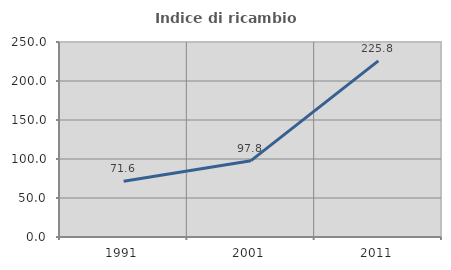
| Category | Indice di ricambio occupazionale  |
|---|---|
| 1991.0 | 71.564 |
| 2001.0 | 97.849 |
| 2011.0 | 225.828 |